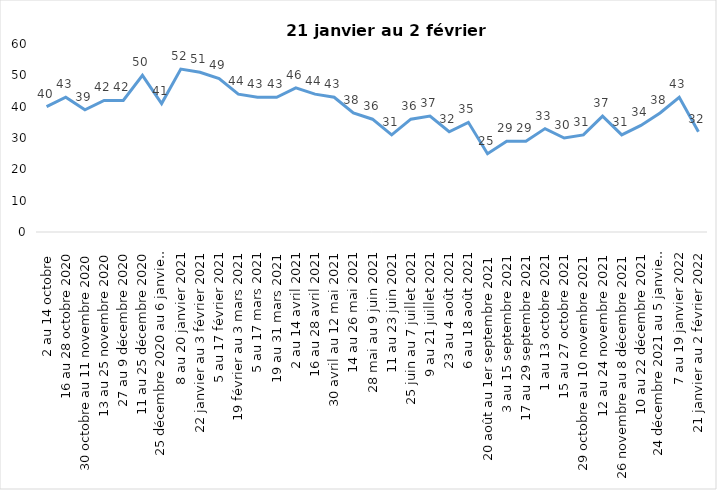
| Category | Toujours aux trois mesures |
|---|---|
| 2 au 14 octobre  | 40 |
| 16 au 28 octobre 2020 | 43 |
| 30 octobre au 11 novembre 2020 | 39 |
| 13 au 25 novembre 2020 | 42 |
| 27 au 9 décembre 2020 | 42 |
| 11 au 25 décembre 2020 | 50 |
| 25 décembre 2020 au 6 janvier 2021 | 41 |
| 8 au 20 janvier 2021 | 52 |
| 22 janvier au 3 février 2021 | 51 |
| 5 au 17 février 2021 | 49 |
| 19 février au 3 mars 2021 | 44 |
| 5 au 17 mars 2021 | 43 |
| 19 au 31 mars 2021 | 43 |
| 2 au 14 avril 2021 | 46 |
| 16 au 28 avril 2021 | 44 |
| 30 avril au 12 mai 2021 | 43 |
| 14 au 26 mai 2021 | 38 |
| 28 mai au 9 juin 2021 | 36 |
| 11 au 23 juin 2021 | 31 |
| 25 juin au 7 juillet 2021 | 36 |
| 9 au 21 juillet 2021 | 37 |
| 23 au 4 août 2021 | 32 |
| 6 au 18 août 2021 | 35 |
| 20 août au 1er septembre 2021 | 25 |
| 3 au 15 septembre 2021 | 29 |
| 17 au 29 septembre 2021 | 29 |
| 1 au 13 octobre 2021 | 33 |
| 15 au 27 octobre 2021 | 30 |
| 29 octobre au 10 novembre 2021 | 31 |
| 12 au 24 novembre 2021 | 37 |
| 26 novembre au 8 décembre 2021 | 31 |
| 10 au 22 décembre 2021 | 34 |
| 24 décembre 2021 au 5 janvier 2022 2022 | 38 |
| 7 au 19 janvier 2022 | 43 |
| 21 janvier au 2 février 2022 | 32 |